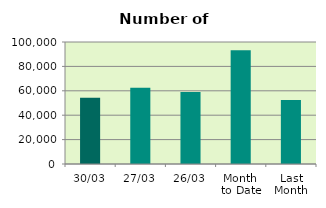
| Category | Series 0 |
|---|---|
| 30/03 | 54314 |
| 27/03 | 62582 |
| 26/03 | 58936 |
| Month 
to Date | 93322.762 |
| Last
Month | 52501.6 |